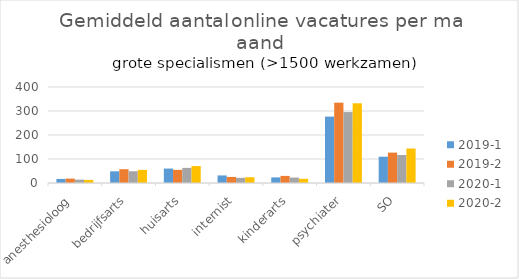
| Category | 2019-1 | 2019-2 | 2020-1 | 2020-2 |
|---|---|---|---|---|
| anesthesioloog | 17 | 18.333 | 14 | 12.833 |
| bedrijfsarts | 48.667 | 57.5 | 49 | 54.667 |
| huisarts | 60.167 | 54.833 | 63 | 70.5 |
| internist | 31.5 | 25.333 | 21.5 | 24 |
| kinderarts | 23.333 | 29.5 | 22.667 | 17.5 |
| psychiater | 276.667 | 334.667 | 295.5 | 332.167 |
| SO | 109.5 | 126.667 | 116.667 | 143.667 |